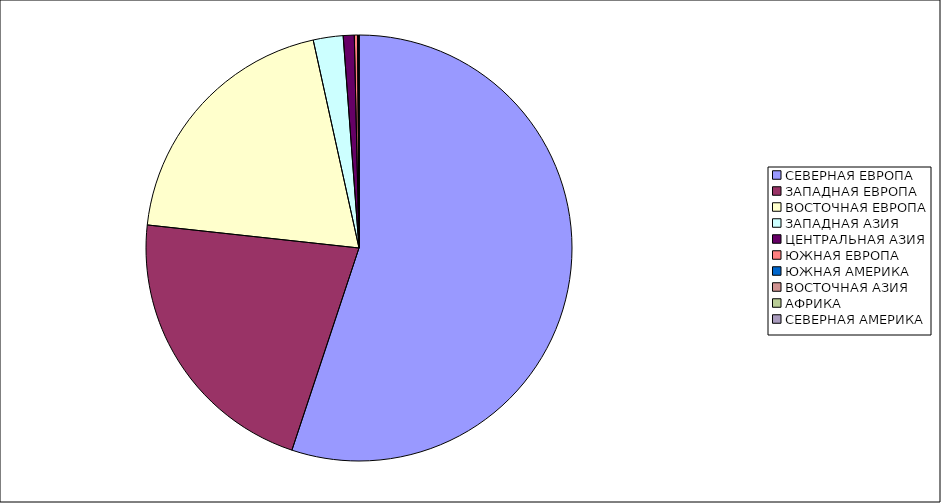
| Category | Оборот |
|---|---|
| СЕВЕРНАЯ ЕВРОПА | 55.1 |
| ЗАПАДНАЯ ЕВРОПА | 21.626 |
| ВОСТОЧНАЯ ЕВРОПА | 19.822 |
| ЗАПАДНАЯ АЗИЯ | 2.263 |
| ЦЕНТРАЛЬНАЯ АЗИЯ | 0.836 |
| ЮЖНАЯ ЕВРОПА | 0.25 |
| ЮЖНАЯ АМЕРИКА | 0.042 |
| ВОСТОЧНАЯ АЗИЯ | 0.034 |
| АФРИКА | 0.02 |
| СЕВЕРНАЯ АМЕРИКА | 0.006 |